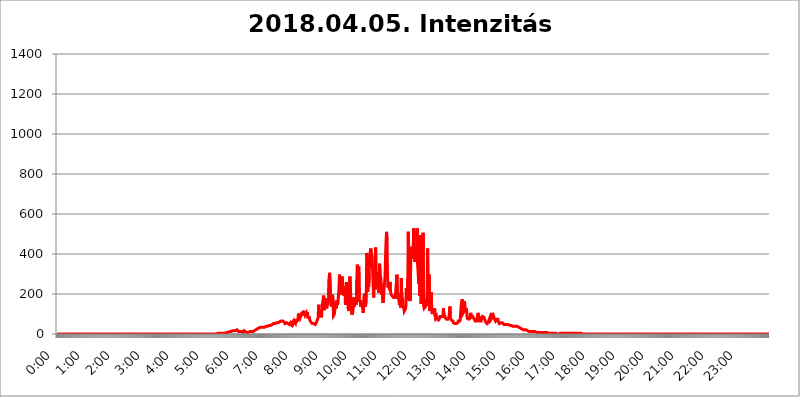
| Category | 2018.04.05. Intenzitás [W/m^2] |
|---|---|
| 0.0 | 0 |
| 0.0006944444444444445 | 0 |
| 0.001388888888888889 | 0 |
| 0.0020833333333333333 | 0 |
| 0.002777777777777778 | 0 |
| 0.003472222222222222 | 0 |
| 0.004166666666666667 | 0 |
| 0.004861111111111111 | 0 |
| 0.005555555555555556 | 0 |
| 0.0062499999999999995 | 0 |
| 0.006944444444444444 | 0 |
| 0.007638888888888889 | 0 |
| 0.008333333333333333 | 0 |
| 0.009027777777777779 | 0 |
| 0.009722222222222222 | 0 |
| 0.010416666666666666 | 0 |
| 0.011111111111111112 | 0 |
| 0.011805555555555555 | 0 |
| 0.012499999999999999 | 0 |
| 0.013194444444444444 | 0 |
| 0.013888888888888888 | 0 |
| 0.014583333333333332 | 0 |
| 0.015277777777777777 | 0 |
| 0.015972222222222224 | 0 |
| 0.016666666666666666 | 0 |
| 0.017361111111111112 | 0 |
| 0.018055555555555557 | 0 |
| 0.01875 | 0 |
| 0.019444444444444445 | 0 |
| 0.02013888888888889 | 0 |
| 0.020833333333333332 | 0 |
| 0.02152777777777778 | 0 |
| 0.022222222222222223 | 0 |
| 0.02291666666666667 | 0 |
| 0.02361111111111111 | 0 |
| 0.024305555555555556 | 0 |
| 0.024999999999999998 | 0 |
| 0.025694444444444447 | 0 |
| 0.02638888888888889 | 0 |
| 0.027083333333333334 | 0 |
| 0.027777777777777776 | 0 |
| 0.02847222222222222 | 0 |
| 0.029166666666666664 | 0 |
| 0.029861111111111113 | 0 |
| 0.030555555555555555 | 0 |
| 0.03125 | 0 |
| 0.03194444444444445 | 0 |
| 0.03263888888888889 | 0 |
| 0.03333333333333333 | 0 |
| 0.034027777777777775 | 0 |
| 0.034722222222222224 | 0 |
| 0.035416666666666666 | 0 |
| 0.036111111111111115 | 0 |
| 0.03680555555555556 | 0 |
| 0.0375 | 0 |
| 0.03819444444444444 | 0 |
| 0.03888888888888889 | 0 |
| 0.03958333333333333 | 0 |
| 0.04027777777777778 | 0 |
| 0.04097222222222222 | 0 |
| 0.041666666666666664 | 0 |
| 0.042361111111111106 | 0 |
| 0.04305555555555556 | 0 |
| 0.043750000000000004 | 0 |
| 0.044444444444444446 | 0 |
| 0.04513888888888889 | 0 |
| 0.04583333333333334 | 0 |
| 0.04652777777777778 | 0 |
| 0.04722222222222222 | 0 |
| 0.04791666666666666 | 0 |
| 0.04861111111111111 | 0 |
| 0.049305555555555554 | 0 |
| 0.049999999999999996 | 0 |
| 0.05069444444444445 | 0 |
| 0.051388888888888894 | 0 |
| 0.052083333333333336 | 0 |
| 0.05277777777777778 | 0 |
| 0.05347222222222222 | 0 |
| 0.05416666666666667 | 0 |
| 0.05486111111111111 | 0 |
| 0.05555555555555555 | 0 |
| 0.05625 | 0 |
| 0.05694444444444444 | 0 |
| 0.057638888888888885 | 0 |
| 0.05833333333333333 | 0 |
| 0.05902777777777778 | 0 |
| 0.059722222222222225 | 0 |
| 0.06041666666666667 | 0 |
| 0.061111111111111116 | 0 |
| 0.06180555555555556 | 0 |
| 0.0625 | 0 |
| 0.06319444444444444 | 0 |
| 0.06388888888888888 | 0 |
| 0.06458333333333334 | 0 |
| 0.06527777777777778 | 0 |
| 0.06597222222222222 | 0 |
| 0.06666666666666667 | 0 |
| 0.06736111111111111 | 0 |
| 0.06805555555555555 | 0 |
| 0.06874999999999999 | 0 |
| 0.06944444444444443 | 0 |
| 0.07013888888888889 | 0 |
| 0.07083333333333333 | 0 |
| 0.07152777777777779 | 0 |
| 0.07222222222222223 | 0 |
| 0.07291666666666667 | 0 |
| 0.07361111111111111 | 0 |
| 0.07430555555555556 | 0 |
| 0.075 | 0 |
| 0.07569444444444444 | 0 |
| 0.0763888888888889 | 0 |
| 0.07708333333333334 | 0 |
| 0.07777777777777778 | 0 |
| 0.07847222222222222 | 0 |
| 0.07916666666666666 | 0 |
| 0.0798611111111111 | 0 |
| 0.08055555555555556 | 0 |
| 0.08125 | 0 |
| 0.08194444444444444 | 0 |
| 0.08263888888888889 | 0 |
| 0.08333333333333333 | 0 |
| 0.08402777777777777 | 0 |
| 0.08472222222222221 | 0 |
| 0.08541666666666665 | 0 |
| 0.08611111111111112 | 0 |
| 0.08680555555555557 | 0 |
| 0.08750000000000001 | 0 |
| 0.08819444444444445 | 0 |
| 0.08888888888888889 | 0 |
| 0.08958333333333333 | 0 |
| 0.09027777777777778 | 0 |
| 0.09097222222222222 | 0 |
| 0.09166666666666667 | 0 |
| 0.09236111111111112 | 0 |
| 0.09305555555555556 | 0 |
| 0.09375 | 0 |
| 0.09444444444444444 | 0 |
| 0.09513888888888888 | 0 |
| 0.09583333333333333 | 0 |
| 0.09652777777777777 | 0 |
| 0.09722222222222222 | 0 |
| 0.09791666666666667 | 0 |
| 0.09861111111111111 | 0 |
| 0.09930555555555555 | 0 |
| 0.09999999999999999 | 0 |
| 0.10069444444444443 | 0 |
| 0.1013888888888889 | 0 |
| 0.10208333333333335 | 0 |
| 0.10277777777777779 | 0 |
| 0.10347222222222223 | 0 |
| 0.10416666666666667 | 0 |
| 0.10486111111111111 | 0 |
| 0.10555555555555556 | 0 |
| 0.10625 | 0 |
| 0.10694444444444444 | 0 |
| 0.1076388888888889 | 0 |
| 0.10833333333333334 | 0 |
| 0.10902777777777778 | 0 |
| 0.10972222222222222 | 0 |
| 0.1111111111111111 | 0 |
| 0.11180555555555556 | 0 |
| 0.11180555555555556 | 0 |
| 0.1125 | 0 |
| 0.11319444444444444 | 0 |
| 0.11388888888888889 | 0 |
| 0.11458333333333333 | 0 |
| 0.11527777777777777 | 0 |
| 0.11597222222222221 | 0 |
| 0.11666666666666665 | 0 |
| 0.1173611111111111 | 0 |
| 0.11805555555555557 | 0 |
| 0.11944444444444445 | 0 |
| 0.12013888888888889 | 0 |
| 0.12083333333333333 | 0 |
| 0.12152777777777778 | 0 |
| 0.12222222222222223 | 0 |
| 0.12291666666666667 | 0 |
| 0.12291666666666667 | 0 |
| 0.12361111111111112 | 0 |
| 0.12430555555555556 | 0 |
| 0.125 | 0 |
| 0.12569444444444444 | 0 |
| 0.12638888888888888 | 0 |
| 0.12708333333333333 | 0 |
| 0.16875 | 0 |
| 0.12847222222222224 | 0 |
| 0.12916666666666668 | 0 |
| 0.12986111111111112 | 0 |
| 0.13055555555555556 | 0 |
| 0.13125 | 0 |
| 0.13194444444444445 | 0 |
| 0.1326388888888889 | 0 |
| 0.13333333333333333 | 0 |
| 0.13402777777777777 | 0 |
| 0.13402777777777777 | 0 |
| 0.13472222222222222 | 0 |
| 0.13541666666666666 | 0 |
| 0.1361111111111111 | 0 |
| 0.13749999999999998 | 0 |
| 0.13819444444444443 | 0 |
| 0.1388888888888889 | 0 |
| 0.13958333333333334 | 0 |
| 0.14027777777777778 | 0 |
| 0.14097222222222222 | 0 |
| 0.14166666666666666 | 0 |
| 0.1423611111111111 | 0 |
| 0.14305555555555557 | 0 |
| 0.14375000000000002 | 0 |
| 0.14444444444444446 | 0 |
| 0.1451388888888889 | 0 |
| 0.1451388888888889 | 0 |
| 0.14652777777777778 | 0 |
| 0.14722222222222223 | 0 |
| 0.14791666666666667 | 0 |
| 0.1486111111111111 | 0 |
| 0.14930555555555555 | 0 |
| 0.15 | 0 |
| 0.15069444444444444 | 0 |
| 0.15138888888888888 | 0 |
| 0.15208333333333332 | 0 |
| 0.15277777777777776 | 0 |
| 0.15347222222222223 | 0 |
| 0.15416666666666667 | 0 |
| 0.15486111111111112 | 0 |
| 0.15555555555555556 | 0 |
| 0.15625 | 0 |
| 0.15694444444444444 | 0 |
| 0.15763888888888888 | 0 |
| 0.15833333333333333 | 0 |
| 0.15902777777777777 | 0 |
| 0.15972222222222224 | 0 |
| 0.16041666666666668 | 0 |
| 0.16111111111111112 | 0 |
| 0.16180555555555556 | 0 |
| 0.1625 | 0 |
| 0.16319444444444445 | 0 |
| 0.1638888888888889 | 0 |
| 0.16458333333333333 | 0 |
| 0.16527777777777777 | 0 |
| 0.16597222222222222 | 0 |
| 0.16666666666666666 | 0 |
| 0.1673611111111111 | 0 |
| 0.16805555555555554 | 0 |
| 0.16874999999999998 | 0 |
| 0.16944444444444443 | 0 |
| 0.17013888888888887 | 0 |
| 0.1708333333333333 | 0 |
| 0.17152777777777775 | 0 |
| 0.17222222222222225 | 0 |
| 0.1729166666666667 | 0 |
| 0.17361111111111113 | 0 |
| 0.17430555555555557 | 0 |
| 0.17500000000000002 | 0 |
| 0.17569444444444446 | 0 |
| 0.1763888888888889 | 0 |
| 0.17708333333333334 | 0 |
| 0.17777777777777778 | 0 |
| 0.17847222222222223 | 0 |
| 0.17916666666666667 | 0 |
| 0.1798611111111111 | 0 |
| 0.18055555555555555 | 0 |
| 0.18125 | 0 |
| 0.18194444444444444 | 0 |
| 0.1826388888888889 | 0 |
| 0.18333333333333335 | 0 |
| 0.1840277777777778 | 0 |
| 0.18472222222222223 | 0 |
| 0.18541666666666667 | 0 |
| 0.18611111111111112 | 0 |
| 0.18680555555555556 | 0 |
| 0.1875 | 0 |
| 0.18819444444444444 | 0 |
| 0.18888888888888888 | 0 |
| 0.18958333333333333 | 0 |
| 0.19027777777777777 | 0 |
| 0.1909722222222222 | 0 |
| 0.19166666666666665 | 0 |
| 0.19236111111111112 | 0 |
| 0.19305555555555554 | 0 |
| 0.19375 | 0 |
| 0.19444444444444445 | 0 |
| 0.1951388888888889 | 0 |
| 0.19583333333333333 | 0 |
| 0.19652777777777777 | 0 |
| 0.19722222222222222 | 0 |
| 0.19791666666666666 | 0 |
| 0.1986111111111111 | 0 |
| 0.19930555555555554 | 0 |
| 0.19999999999999998 | 0 |
| 0.20069444444444443 | 0 |
| 0.20138888888888887 | 0 |
| 0.2020833333333333 | 0 |
| 0.2027777777777778 | 0 |
| 0.2034722222222222 | 0 |
| 0.2041666666666667 | 0 |
| 0.20486111111111113 | 0 |
| 0.20555555555555557 | 0 |
| 0.20625000000000002 | 0 |
| 0.20694444444444446 | 0 |
| 0.2076388888888889 | 0 |
| 0.20833333333333334 | 0 |
| 0.20902777777777778 | 0 |
| 0.20972222222222223 | 0 |
| 0.21041666666666667 | 0 |
| 0.2111111111111111 | 0 |
| 0.21180555555555555 | 0 |
| 0.2125 | 0 |
| 0.21319444444444444 | 0 |
| 0.2138888888888889 | 0 |
| 0.21458333333333335 | 0 |
| 0.2152777777777778 | 0 |
| 0.21597222222222223 | 0 |
| 0.21666666666666667 | 0 |
| 0.21736111111111112 | 0 |
| 0.21805555555555556 | 0 |
| 0.21875 | 0 |
| 0.21944444444444444 | 0 |
| 0.22013888888888888 | 0 |
| 0.22083333333333333 | 0 |
| 0.22152777777777777 | 0 |
| 0.2222222222222222 | 0 |
| 0.22291666666666665 | 0 |
| 0.2236111111111111 | 0 |
| 0.22430555555555556 | 3.525 |
| 0.225 | 3.525 |
| 0.22569444444444445 | 3.525 |
| 0.2263888888888889 | 3.525 |
| 0.22708333333333333 | 3.525 |
| 0.22777777777777777 | 3.525 |
| 0.22847222222222222 | 3.525 |
| 0.22916666666666666 | 3.525 |
| 0.2298611111111111 | 3.525 |
| 0.23055555555555554 | 3.525 |
| 0.23124999999999998 | 3.525 |
| 0.23194444444444443 | 3.525 |
| 0.23263888888888887 | 3.525 |
| 0.2333333333333333 | 3.525 |
| 0.2340277777777778 | 3.525 |
| 0.2347222222222222 | 3.525 |
| 0.2354166666666667 | 3.525 |
| 0.23611111111111113 | 3.525 |
| 0.23680555555555557 | 7.887 |
| 0.23750000000000002 | 7.887 |
| 0.23819444444444446 | 7.887 |
| 0.2388888888888889 | 7.887 |
| 0.23958333333333334 | 7.887 |
| 0.24027777777777778 | 7.887 |
| 0.24097222222222223 | 7.887 |
| 0.24166666666666667 | 12.257 |
| 0.2423611111111111 | 12.257 |
| 0.24305555555555555 | 12.257 |
| 0.24375 | 12.257 |
| 0.24444444444444446 | 12.257 |
| 0.24513888888888888 | 16.636 |
| 0.24583333333333335 | 16.636 |
| 0.2465277777777778 | 16.636 |
| 0.24722222222222223 | 16.636 |
| 0.24791666666666667 | 16.636 |
| 0.24861111111111112 | 21.024 |
| 0.24930555555555556 | 16.636 |
| 0.25 | 16.636 |
| 0.25069444444444444 | 21.024 |
| 0.2513888888888889 | 21.024 |
| 0.2520833333333333 | 21.024 |
| 0.25277777777777777 | 21.024 |
| 0.2534722222222222 | 16.636 |
| 0.25416666666666665 | 12.257 |
| 0.2548611111111111 | 12.257 |
| 0.2555555555555556 | 16.636 |
| 0.25625000000000003 | 12.257 |
| 0.2569444444444445 | 12.257 |
| 0.2576388888888889 | 12.257 |
| 0.25833333333333336 | 12.257 |
| 0.2590277777777778 | 12.257 |
| 0.25972222222222224 | 7.887 |
| 0.2604166666666667 | 7.887 |
| 0.2611111111111111 | 12.257 |
| 0.26180555555555557 | 16.636 |
| 0.2625 | 16.636 |
| 0.26319444444444445 | 12.257 |
| 0.2638888888888889 | 12.257 |
| 0.26458333333333334 | 16.636 |
| 0.2652777777777778 | 12.257 |
| 0.2659722222222222 | 7.887 |
| 0.26666666666666666 | 7.887 |
| 0.2673611111111111 | 7.887 |
| 0.26805555555555555 | 7.887 |
| 0.26875 | 12.257 |
| 0.26944444444444443 | 12.257 |
| 0.2701388888888889 | 12.257 |
| 0.2708333333333333 | 12.257 |
| 0.27152777777777776 | 12.257 |
| 0.2722222222222222 | 12.257 |
| 0.27291666666666664 | 12.257 |
| 0.2736111111111111 | 12.257 |
| 0.2743055555555555 | 12.257 |
| 0.27499999999999997 | 12.257 |
| 0.27569444444444446 | 12.257 |
| 0.27638888888888885 | 16.636 |
| 0.27708333333333335 | 16.636 |
| 0.2777777777777778 | 16.636 |
| 0.27847222222222223 | 21.024 |
| 0.2791666666666667 | 25.419 |
| 0.2798611111111111 | 25.419 |
| 0.28055555555555556 | 25.419 |
| 0.28125 | 29.823 |
| 0.28194444444444444 | 29.823 |
| 0.2826388888888889 | 29.823 |
| 0.2833333333333333 | 29.823 |
| 0.28402777777777777 | 34.234 |
| 0.2847222222222222 | 34.234 |
| 0.28541666666666665 | 34.234 |
| 0.28611111111111115 | 34.234 |
| 0.28680555555555554 | 34.234 |
| 0.28750000000000003 | 34.234 |
| 0.2881944444444445 | 34.234 |
| 0.2888888888888889 | 34.234 |
| 0.28958333333333336 | 34.234 |
| 0.2902777777777778 | 34.234 |
| 0.29097222222222224 | 34.234 |
| 0.2916666666666667 | 38.653 |
| 0.2923611111111111 | 38.653 |
| 0.29305555555555557 | 38.653 |
| 0.29375 | 38.653 |
| 0.29444444444444445 | 38.653 |
| 0.2951388888888889 | 38.653 |
| 0.29583333333333334 | 38.653 |
| 0.2965277777777778 | 43.079 |
| 0.2972222222222222 | 43.079 |
| 0.29791666666666666 | 43.079 |
| 0.2986111111111111 | 43.079 |
| 0.29930555555555555 | 43.079 |
| 0.3 | 43.079 |
| 0.30069444444444443 | 47.511 |
| 0.3013888888888889 | 47.511 |
| 0.3020833333333333 | 47.511 |
| 0.30277777777777776 | 51.951 |
| 0.3034722222222222 | 51.951 |
| 0.30416666666666664 | 51.951 |
| 0.3048611111111111 | 51.951 |
| 0.3055555555555555 | 51.951 |
| 0.30624999999999997 | 56.398 |
| 0.3069444444444444 | 56.398 |
| 0.3076388888888889 | 56.398 |
| 0.30833333333333335 | 56.398 |
| 0.3090277777777778 | 56.398 |
| 0.30972222222222223 | 56.398 |
| 0.3104166666666667 | 60.85 |
| 0.3111111111111111 | 60.85 |
| 0.31180555555555556 | 60.85 |
| 0.3125 | 60.85 |
| 0.31319444444444444 | 60.85 |
| 0.3138888888888889 | 65.31 |
| 0.3145833333333333 | 65.31 |
| 0.31527777777777777 | 65.31 |
| 0.3159722222222222 | 65.31 |
| 0.31666666666666665 | 65.31 |
| 0.31736111111111115 | 65.31 |
| 0.31805555555555554 | 60.85 |
| 0.31875000000000003 | 60.85 |
| 0.3194444444444445 | 51.951 |
| 0.3201388888888889 | 51.951 |
| 0.32083333333333336 | 56.398 |
| 0.3215277777777778 | 56.398 |
| 0.32222222222222224 | 56.398 |
| 0.3229166666666667 | 51.951 |
| 0.3236111111111111 | 51.951 |
| 0.32430555555555557 | 51.951 |
| 0.325 | 51.951 |
| 0.32569444444444445 | 47.511 |
| 0.3263888888888889 | 51.951 |
| 0.32708333333333334 | 56.398 |
| 0.3277777777777778 | 51.951 |
| 0.3284722222222222 | 47.511 |
| 0.32916666666666666 | 47.511 |
| 0.3298611111111111 | 56.398 |
| 0.33055555555555555 | 47.511 |
| 0.33125 | 51.951 |
| 0.33194444444444443 | 56.398 |
| 0.3326388888888889 | 65.31 |
| 0.3333333333333333 | 65.31 |
| 0.3340277777777778 | 56.398 |
| 0.3347222222222222 | 74.246 |
| 0.3354166666666667 | 60.85 |
| 0.3361111111111111 | 65.31 |
| 0.3368055555555556 | 60.85 |
| 0.33749999999999997 | 69.775 |
| 0.33819444444444446 | 96.682 |
| 0.33888888888888885 | 92.184 |
| 0.33958333333333335 | 92.184 |
| 0.34027777777777773 | 96.682 |
| 0.34097222222222223 | 83.205 |
| 0.3416666666666666 | 78.722 |
| 0.3423611111111111 | 96.682 |
| 0.3430555555555555 | 105.69 |
| 0.34375 | 105.69 |
| 0.3444444444444445 | 101.184 |
| 0.3451388888888889 | 110.201 |
| 0.3458333333333334 | 101.184 |
| 0.34652777777777777 | 92.184 |
| 0.34722222222222227 | 114.716 |
| 0.34791666666666665 | 96.682 |
| 0.34861111111111115 | 101.184 |
| 0.34930555555555554 | 105.69 |
| 0.35000000000000003 | 92.184 |
| 0.3506944444444444 | 110.201 |
| 0.3513888888888889 | 83.205 |
| 0.3520833333333333 | 78.722 |
| 0.3527777777777778 | 78.722 |
| 0.3534722222222222 | 83.205 |
| 0.3541666666666667 | 69.775 |
| 0.3548611111111111 | 65.31 |
| 0.35555555555555557 | 60.85 |
| 0.35625 | 60.85 |
| 0.35694444444444445 | 56.398 |
| 0.3576388888888889 | 51.951 |
| 0.35833333333333334 | 51.951 |
| 0.3590277777777778 | 51.951 |
| 0.3597222222222222 | 51.951 |
| 0.36041666666666666 | 51.951 |
| 0.3611111111111111 | 47.511 |
| 0.36180555555555555 | 47.511 |
| 0.3625 | 51.951 |
| 0.36319444444444443 | 56.398 |
| 0.3638888888888889 | 56.398 |
| 0.3645833333333333 | 60.85 |
| 0.3652777777777778 | 74.246 |
| 0.3659722222222222 | 83.205 |
| 0.3666666666666667 | 146.423 |
| 0.3673611111111111 | 87.692 |
| 0.3680555555555556 | 110.201 |
| 0.36874999999999997 | 123.758 |
| 0.36944444444444446 | 101.184 |
| 0.37013888888888885 | 83.205 |
| 0.37083333333333335 | 92.184 |
| 0.37152777777777773 | 146.423 |
| 0.37222222222222223 | 155.509 |
| 0.3729166666666666 | 160.056 |
| 0.3736111111111111 | 191.937 |
| 0.3743055555555555 | 119.235 |
| 0.375 | 146.423 |
| 0.3756944444444445 | 178.264 |
| 0.3763888888888889 | 137.347 |
| 0.3770833333333334 | 155.509 |
| 0.37777777777777777 | 128.284 |
| 0.37847222222222227 | 132.814 |
| 0.37916666666666665 | 123.758 |
| 0.37986111111111115 | 173.709 |
| 0.38055555555555554 | 160.056 |
| 0.38125000000000003 | 274.047 |
| 0.3819444444444444 | 305.898 |
| 0.3826388888888889 | 301.354 |
| 0.3833333333333333 | 301.354 |
| 0.3840277777777778 | 146.423 |
| 0.3847222222222222 | 137.347 |
| 0.3854166666666667 | 160.056 |
| 0.3861111111111111 | 196.497 |
| 0.38680555555555557 | 164.605 |
| 0.3875 | 92.184 |
| 0.38819444444444445 | 92.184 |
| 0.3888888888888889 | 101.184 |
| 0.38958333333333334 | 132.814 |
| 0.3902777777777778 | 160.056 |
| 0.3909722222222222 | 128.284 |
| 0.39166666666666666 | 123.758 |
| 0.3923611111111111 | 169.156 |
| 0.39305555555555555 | 146.423 |
| 0.39375 | 160.056 |
| 0.39444444444444443 | 164.605 |
| 0.3951388888888889 | 228.436 |
| 0.3958333333333333 | 296.808 |
| 0.3965277777777778 | 219.309 |
| 0.3972222222222222 | 196.497 |
| 0.3979166666666667 | 255.813 |
| 0.3986111111111111 | 260.373 |
| 0.3993055555555556 | 287.709 |
| 0.39999999999999997 | 274.047 |
| 0.40069444444444446 | 228.436 |
| 0.40138888888888885 | 228.436 |
| 0.40208333333333335 | 191.937 |
| 0.40277777777777773 | 237.564 |
| 0.40347222222222223 | 219.309 |
| 0.4041666666666666 | 146.423 |
| 0.4048611111111111 | 182.82 |
| 0.4055555555555555 | 260.373 |
| 0.40625 | 178.264 |
| 0.4069444444444445 | 251.251 |
| 0.4076388888888889 | 251.251 |
| 0.4083333333333334 | 123.758 |
| 0.40902777777777777 | 114.716 |
| 0.40972222222222227 | 146.423 |
| 0.41041666666666665 | 287.709 |
| 0.41111111111111115 | 233 |
| 0.41180555555555554 | 173.709 |
| 0.41250000000000003 | 114.716 |
| 0.4131944444444444 | 96.682 |
| 0.4138888888888889 | 101.184 |
| 0.4145833333333333 | 110.201 |
| 0.4152777777777778 | 141.884 |
| 0.4159722222222222 | 182.82 |
| 0.4166666666666667 | 137.347 |
| 0.4173611111111111 | 137.347 |
| 0.41805555555555557 | 178.264 |
| 0.41875 | 164.605 |
| 0.41944444444444445 | 146.423 |
| 0.4201388888888889 | 269.49 |
| 0.42083333333333334 | 346.682 |
| 0.4215277777777778 | 314.98 |
| 0.4222222222222222 | 314.98 |
| 0.42291666666666666 | 337.639 |
| 0.4236111111111111 | 178.264 |
| 0.42430555555555555 | 160.056 |
| 0.425 | 169.156 |
| 0.42569444444444443 | 137.347 |
| 0.4263888888888889 | 137.347 |
| 0.4270833333333333 | 155.509 |
| 0.4277777777777778 | 155.509 |
| 0.4284722222222222 | 128.284 |
| 0.4291666666666667 | 105.69 |
| 0.4298611111111111 | 101.184 |
| 0.4305555555555556 | 191.937 |
| 0.43124999999999997 | 201.058 |
| 0.43194444444444446 | 137.347 |
| 0.43263888888888885 | 146.423 |
| 0.43333333333333335 | 160.056 |
| 0.43402777777777773 | 405.108 |
| 0.43472222222222223 | 387.202 |
| 0.4354166666666666 | 210.182 |
| 0.4361111111111111 | 255.813 |
| 0.4368055555555555 | 237.564 |
| 0.4375 | 287.709 |
| 0.4381944444444445 | 391.685 |
| 0.4388888888888889 | 405.108 |
| 0.4395833333333334 | 427.39 |
| 0.44027777777777777 | 427.39 |
| 0.44097222222222227 | 431.833 |
| 0.44166666666666665 | 378.224 |
| 0.44236111111111115 | 310.44 |
| 0.44305555555555554 | 305.898 |
| 0.44375000000000003 | 182.82 |
| 0.4444444444444444 | 314.98 |
| 0.4451388888888889 | 319.517 |
| 0.4458333333333333 | 283.156 |
| 0.4465277777777778 | 431.833 |
| 0.4472222222222222 | 223.873 |
| 0.4479166666666667 | 223.873 |
| 0.4486111111111111 | 287.709 |
| 0.44930555555555557 | 278.603 |
| 0.45 | 228.436 |
| 0.45069444444444445 | 310.44 |
| 0.4513888888888889 | 205.62 |
| 0.45208333333333334 | 351.198 |
| 0.4527777777777778 | 305.898 |
| 0.4534722222222222 | 287.709 |
| 0.45416666666666666 | 269.49 |
| 0.4548611111111111 | 196.497 |
| 0.45555555555555555 | 242.127 |
| 0.45625 | 178.264 |
| 0.45694444444444443 | 155.509 |
| 0.4576388888888889 | 187.378 |
| 0.4583333333333333 | 223.873 |
| 0.4590277777777778 | 228.436 |
| 0.4597222222222222 | 283.156 |
| 0.4604166666666667 | 382.715 |
| 0.4611111111111111 | 458.38 |
| 0.4618055555555556 | 510.885 |
| 0.46249999999999997 | 471.582 |
| 0.46319444444444446 | 292.259 |
| 0.46388888888888885 | 233 |
| 0.46458333333333335 | 233 |
| 0.46527777777777773 | 255.813 |
| 0.46597222222222223 | 219.309 |
| 0.4666666666666666 | 260.373 |
| 0.4673611111111111 | 214.746 |
| 0.4680555555555555 | 201.058 |
| 0.46875 | 201.058 |
| 0.4694444444444445 | 191.937 |
| 0.4701388888888889 | 191.937 |
| 0.4708333333333334 | 187.378 |
| 0.47152777777777777 | 182.82 |
| 0.47222222222222227 | 178.264 |
| 0.47291666666666665 | 182.82 |
| 0.47361111111111115 | 182.82 |
| 0.47430555555555554 | 191.937 |
| 0.47500000000000003 | 191.937 |
| 0.4756944444444444 | 196.497 |
| 0.4763888888888889 | 296.808 |
| 0.4770833333333333 | 178.264 |
| 0.4777777777777778 | 201.058 |
| 0.4784722222222222 | 178.264 |
| 0.4791666666666667 | 169.156 |
| 0.4798611111111111 | 146.423 |
| 0.48055555555555557 | 155.509 |
| 0.48125 | 141.884 |
| 0.48194444444444445 | 132.814 |
| 0.4826388888888889 | 278.603 |
| 0.48333333333333334 | 150.964 |
| 0.4840277777777778 | 150.964 |
| 0.4847222222222222 | 160.056 |
| 0.48541666666666666 | 132.814 |
| 0.4861111111111111 | 141.884 |
| 0.48680555555555555 | 114.716 |
| 0.4875 | 114.716 |
| 0.48819444444444443 | 123.758 |
| 0.4888888888888889 | 132.814 |
| 0.4895833333333333 | 228.436 |
| 0.4902777777777778 | 178.264 |
| 0.4909722222222222 | 169.156 |
| 0.4916666666666667 | 278.603 |
| 0.4923611111111111 | 510.885 |
| 0.4930555555555556 | 287.709 |
| 0.49374999999999997 | 173.709 |
| 0.49444444444444446 | 169.156 |
| 0.49513888888888885 | 164.605 |
| 0.49583333333333335 | 436.27 |
| 0.49652777777777773 | 405.108 |
| 0.49722222222222223 | 427.39 |
| 0.4979166666666666 | 378.224 |
| 0.4986111111111111 | 378.224 |
| 0.4993055555555555 | 431.833 |
| 0.5 | 528.2 |
| 0.5006944444444444 | 471.582 |
| 0.5013888888888889 | 360.221 |
| 0.5020833333333333 | 382.715 |
| 0.5027777777777778 | 387.202 |
| 0.5034722222222222 | 373.729 |
| 0.5041666666666667 | 431.833 |
| 0.5048611111111111 | 528.2 |
| 0.5055555555555555 | 342.162 |
| 0.50625 | 301.354 |
| 0.5069444444444444 | 251.251 |
| 0.5076388888888889 | 328.584 |
| 0.5083333333333333 | 191.937 |
| 0.5090277777777777 | 493.475 |
| 0.5097222222222222 | 191.937 |
| 0.5104166666666666 | 150.964 |
| 0.5111111111111112 | 191.937 |
| 0.5118055555555555 | 274.047 |
| 0.5125000000000001 | 431.833 |
| 0.5131944444444444 | 506.542 |
| 0.513888888888889 | 141.884 |
| 0.5145833333333333 | 128.284 |
| 0.5152777777777778 | 123.758 |
| 0.5159722222222222 | 132.814 |
| 0.5166666666666667 | 137.347 |
| 0.517361111111111 | 164.605 |
| 0.5180555555555556 | 164.605 |
| 0.5187499999999999 | 182.82 |
| 0.5194444444444445 | 427.39 |
| 0.5201388888888888 | 141.884 |
| 0.5208333333333334 | 146.423 |
| 0.5215277777777778 | 296.808 |
| 0.5222222222222223 | 123.758 |
| 0.5229166666666667 | 114.716 |
| 0.5236111111111111 | 160.056 |
| 0.5243055555555556 | 210.182 |
| 0.525 | 150.964 |
| 0.5256944444444445 | 105.69 |
| 0.5263888888888889 | 101.184 |
| 0.5270833333333333 | 105.69 |
| 0.5277777777777778 | 105.69 |
| 0.5284722222222222 | 105.69 |
| 0.5291666666666667 | 128.284 |
| 0.5298611111111111 | 92.184 |
| 0.5305555555555556 | 78.722 |
| 0.53125 | 74.246 |
| 0.5319444444444444 | 87.692 |
| 0.5326388888888889 | 74.246 |
| 0.5333333333333333 | 69.775 |
| 0.5340277777777778 | 69.775 |
| 0.5347222222222222 | 69.775 |
| 0.5354166666666667 | 74.246 |
| 0.5361111111111111 | 78.722 |
| 0.5368055555555555 | 87.692 |
| 0.5375 | 92.184 |
| 0.5381944444444444 | 92.184 |
| 0.5388888888888889 | 87.692 |
| 0.5395833333333333 | 87.692 |
| 0.5402777777777777 | 87.692 |
| 0.5409722222222222 | 87.692 |
| 0.5416666666666666 | 128.284 |
| 0.5423611111111112 | 87.692 |
| 0.5430555555555555 | 96.682 |
| 0.5437500000000001 | 83.205 |
| 0.5444444444444444 | 83.205 |
| 0.545138888888889 | 78.722 |
| 0.5458333333333333 | 74.246 |
| 0.5465277777777778 | 74.246 |
| 0.5472222222222222 | 74.246 |
| 0.5479166666666667 | 74.246 |
| 0.548611111111111 | 74.246 |
| 0.5493055555555556 | 83.205 |
| 0.5499999999999999 | 83.205 |
| 0.5506944444444445 | 137.347 |
| 0.5513888888888888 | 78.722 |
| 0.5520833333333334 | 74.246 |
| 0.5527777777777778 | 69.775 |
| 0.5534722222222223 | 69.775 |
| 0.5541666666666667 | 65.31 |
| 0.5548611111111111 | 65.31 |
| 0.5555555555555556 | 56.398 |
| 0.55625 | 56.398 |
| 0.5569444444444445 | 56.398 |
| 0.5576388888888889 | 51.951 |
| 0.5583333333333333 | 56.398 |
| 0.5590277777777778 | 51.951 |
| 0.5597222222222222 | 51.951 |
| 0.5604166666666667 | 51.951 |
| 0.5611111111111111 | 56.398 |
| 0.5618055555555556 | 56.398 |
| 0.5625 | 65.31 |
| 0.5631944444444444 | 60.85 |
| 0.5638888888888889 | 65.31 |
| 0.5645833333333333 | 65.31 |
| 0.5652777777777778 | 74.246 |
| 0.5659722222222222 | 78.722 |
| 0.5666666666666667 | 150.964 |
| 0.5673611111111111 | 160.056 |
| 0.5680555555555555 | 173.709 |
| 0.56875 | 101.184 |
| 0.5694444444444444 | 96.682 |
| 0.5701388888888889 | 110.201 |
| 0.5708333333333333 | 164.605 |
| 0.5715277777777777 | 150.964 |
| 0.5722222222222222 | 128.284 |
| 0.5729166666666666 | 110.201 |
| 0.5736111111111112 | 128.284 |
| 0.5743055555555555 | 114.716 |
| 0.5750000000000001 | 78.722 |
| 0.5756944444444444 | 74.246 |
| 0.576388888888889 | 74.246 |
| 0.5770833333333333 | 74.246 |
| 0.5777777777777778 | 74.246 |
| 0.5784722222222222 | 74.246 |
| 0.5791666666666667 | 83.205 |
| 0.579861111111111 | 105.69 |
| 0.5805555555555556 | 83.205 |
| 0.5812499999999999 | 87.692 |
| 0.5819444444444445 | 87.692 |
| 0.5826388888888888 | 87.692 |
| 0.5833333333333334 | 83.205 |
| 0.5840277777777778 | 78.722 |
| 0.5847222222222223 | 74.246 |
| 0.5854166666666667 | 74.246 |
| 0.5861111111111111 | 65.31 |
| 0.5868055555555556 | 65.31 |
| 0.5875 | 65.31 |
| 0.5881944444444445 | 65.31 |
| 0.5888888888888889 | 78.722 |
| 0.5895833333333333 | 78.722 |
| 0.5902777777777778 | 105.69 |
| 0.5909722222222222 | 78.722 |
| 0.5916666666666667 | 74.246 |
| 0.5923611111111111 | 65.31 |
| 0.5930555555555556 | 60.85 |
| 0.59375 | 60.85 |
| 0.5944444444444444 | 65.31 |
| 0.5951388888888889 | 87.692 |
| 0.5958333333333333 | 74.246 |
| 0.5965277777777778 | 87.692 |
| 0.5972222222222222 | 92.184 |
| 0.5979166666666667 | 87.692 |
| 0.5986111111111111 | 83.205 |
| 0.5993055555555555 | 74.246 |
| 0.6 | 74.246 |
| 0.6006944444444444 | 60.85 |
| 0.6013888888888889 | 56.398 |
| 0.6020833333333333 | 60.85 |
| 0.6027777777777777 | 51.951 |
| 0.6034722222222222 | 51.951 |
| 0.6041666666666666 | 56.398 |
| 0.6048611111111112 | 60.85 |
| 0.6055555555555555 | 69.775 |
| 0.6062500000000001 | 65.31 |
| 0.6069444444444444 | 83.205 |
| 0.607638888888889 | 69.775 |
| 0.6083333333333333 | 69.775 |
| 0.6090277777777778 | 74.246 |
| 0.6097222222222222 | 83.205 |
| 0.6104166666666667 | 105.69 |
| 0.611111111111111 | 96.682 |
| 0.6118055555555556 | 92.184 |
| 0.6124999999999999 | 83.205 |
| 0.6131944444444445 | 74.246 |
| 0.6138888888888888 | 69.775 |
| 0.6145833333333334 | 65.31 |
| 0.6152777777777778 | 65.31 |
| 0.6159722222222223 | 74.246 |
| 0.6166666666666667 | 69.775 |
| 0.6173611111111111 | 69.775 |
| 0.6180555555555556 | 74.246 |
| 0.61875 | 60.85 |
| 0.6194444444444445 | 56.398 |
| 0.6201388888888889 | 51.951 |
| 0.6208333333333333 | 56.398 |
| 0.6215277777777778 | 56.398 |
| 0.6222222222222222 | 56.398 |
| 0.6229166666666667 | 56.398 |
| 0.6236111111111111 | 56.398 |
| 0.6243055555555556 | 56.398 |
| 0.625 | 51.951 |
| 0.6256944444444444 | 51.951 |
| 0.6263888888888889 | 47.511 |
| 0.6270833333333333 | 47.511 |
| 0.6277777777777778 | 47.511 |
| 0.6284722222222222 | 47.511 |
| 0.6291666666666667 | 47.511 |
| 0.6298611111111111 | 47.511 |
| 0.6305555555555555 | 47.511 |
| 0.63125 | 47.511 |
| 0.6319444444444444 | 43.079 |
| 0.6326388888888889 | 47.511 |
| 0.6333333333333333 | 47.511 |
| 0.6340277777777777 | 43.079 |
| 0.6347222222222222 | 43.079 |
| 0.6354166666666666 | 43.079 |
| 0.6361111111111112 | 43.079 |
| 0.6368055555555555 | 43.079 |
| 0.6375000000000001 | 43.079 |
| 0.6381944444444444 | 38.653 |
| 0.638888888888889 | 38.653 |
| 0.6395833333333333 | 38.653 |
| 0.6402777777777778 | 38.653 |
| 0.6409722222222222 | 38.653 |
| 0.6416666666666667 | 38.653 |
| 0.642361111111111 | 38.653 |
| 0.6430555555555556 | 38.653 |
| 0.6437499999999999 | 38.653 |
| 0.6444444444444445 | 38.653 |
| 0.6451388888888888 | 38.653 |
| 0.6458333333333334 | 38.653 |
| 0.6465277777777778 | 34.234 |
| 0.6472222222222223 | 34.234 |
| 0.6479166666666667 | 34.234 |
| 0.6486111111111111 | 29.823 |
| 0.6493055555555556 | 29.823 |
| 0.65 | 29.823 |
| 0.6506944444444445 | 25.419 |
| 0.6513888888888889 | 25.419 |
| 0.6520833333333333 | 25.419 |
| 0.6527777777777778 | 25.419 |
| 0.6534722222222222 | 21.024 |
| 0.6541666666666667 | 21.024 |
| 0.6548611111111111 | 21.024 |
| 0.6555555555555556 | 21.024 |
| 0.65625 | 21.024 |
| 0.6569444444444444 | 21.024 |
| 0.6576388888888889 | 21.024 |
| 0.6583333333333333 | 21.024 |
| 0.6590277777777778 | 16.636 |
| 0.6597222222222222 | 16.636 |
| 0.6604166666666667 | 16.636 |
| 0.6611111111111111 | 16.636 |
| 0.6618055555555555 | 12.257 |
| 0.6625 | 16.636 |
| 0.6631944444444444 | 12.257 |
| 0.6638888888888889 | 12.257 |
| 0.6645833333333333 | 12.257 |
| 0.6652777777777777 | 12.257 |
| 0.6659722222222222 | 12.257 |
| 0.6666666666666666 | 12.257 |
| 0.6673611111111111 | 12.257 |
| 0.6680555555555556 | 12.257 |
| 0.6687500000000001 | 12.257 |
| 0.6694444444444444 | 12.257 |
| 0.6701388888888888 | 12.257 |
| 0.6708333333333334 | 12.257 |
| 0.6715277777777778 | 7.887 |
| 0.6722222222222222 | 7.887 |
| 0.6729166666666666 | 7.887 |
| 0.6736111111111112 | 7.887 |
| 0.6743055555555556 | 7.887 |
| 0.6749999999999999 | 7.887 |
| 0.6756944444444444 | 7.887 |
| 0.6763888888888889 | 7.887 |
| 0.6770833333333334 | 7.887 |
| 0.6777777777777777 | 7.887 |
| 0.6784722222222223 | 7.887 |
| 0.6791666666666667 | 7.887 |
| 0.6798611111111111 | 7.887 |
| 0.6805555555555555 | 7.887 |
| 0.68125 | 7.887 |
| 0.6819444444444445 | 7.887 |
| 0.6826388888888889 | 7.887 |
| 0.6833333333333332 | 7.887 |
| 0.6840277777777778 | 7.887 |
| 0.6847222222222222 | 7.887 |
| 0.6854166666666667 | 7.887 |
| 0.686111111111111 | 3.525 |
| 0.6868055555555556 | 7.887 |
| 0.6875 | 7.887 |
| 0.6881944444444444 | 7.887 |
| 0.688888888888889 | 3.525 |
| 0.6895833333333333 | 7.887 |
| 0.6902777777777778 | 3.525 |
| 0.6909722222222222 | 3.525 |
| 0.6916666666666668 | 3.525 |
| 0.6923611111111111 | 3.525 |
| 0.6930555555555555 | 3.525 |
| 0.69375 | 3.525 |
| 0.6944444444444445 | 3.525 |
| 0.6951388888888889 | 3.525 |
| 0.6958333333333333 | 3.525 |
| 0.6965277777777777 | 3.525 |
| 0.6972222222222223 | 3.525 |
| 0.6979166666666666 | 3.525 |
| 0.6986111111111111 | 3.525 |
| 0.6993055555555556 | 3.525 |
| 0.7000000000000001 | 0 |
| 0.7006944444444444 | 3.525 |
| 0.7013888888888888 | 0 |
| 0.7020833333333334 | 0 |
| 0.7027777777777778 | 0 |
| 0.7034722222222222 | 0 |
| 0.7041666666666666 | 3.525 |
| 0.7048611111111112 | 3.525 |
| 0.7055555555555556 | 3.525 |
| 0.7062499999999999 | 3.525 |
| 0.7069444444444444 | 3.525 |
| 0.7076388888888889 | 3.525 |
| 0.7083333333333334 | 3.525 |
| 0.7090277777777777 | 3.525 |
| 0.7097222222222223 | 3.525 |
| 0.7104166666666667 | 3.525 |
| 0.7111111111111111 | 3.525 |
| 0.7118055555555555 | 3.525 |
| 0.7125 | 3.525 |
| 0.7131944444444445 | 3.525 |
| 0.7138888888888889 | 3.525 |
| 0.7145833333333332 | 3.525 |
| 0.7152777777777778 | 3.525 |
| 0.7159722222222222 | 3.525 |
| 0.7166666666666667 | 3.525 |
| 0.717361111111111 | 3.525 |
| 0.7180555555555556 | 3.525 |
| 0.71875 | 3.525 |
| 0.7194444444444444 | 3.525 |
| 0.720138888888889 | 3.525 |
| 0.7208333333333333 | 3.525 |
| 0.7215277777777778 | 3.525 |
| 0.7222222222222222 | 3.525 |
| 0.7229166666666668 | 3.525 |
| 0.7236111111111111 | 3.525 |
| 0.7243055555555555 | 3.525 |
| 0.725 | 3.525 |
| 0.7256944444444445 | 3.525 |
| 0.7263888888888889 | 3.525 |
| 0.7270833333333333 | 3.525 |
| 0.7277777777777777 | 3.525 |
| 0.7284722222222223 | 3.525 |
| 0.7291666666666666 | 3.525 |
| 0.7298611111111111 | 3.525 |
| 0.7305555555555556 | 3.525 |
| 0.7312500000000001 | 3.525 |
| 0.7319444444444444 | 0 |
| 0.7326388888888888 | 3.525 |
| 0.7333333333333334 | 0 |
| 0.7340277777777778 | 0 |
| 0.7347222222222222 | 3.525 |
| 0.7354166666666666 | 0 |
| 0.7361111111111112 | 0 |
| 0.7368055555555556 | 0 |
| 0.7374999999999999 | 0 |
| 0.7381944444444444 | 0 |
| 0.7388888888888889 | 0 |
| 0.7395833333333334 | 0 |
| 0.7402777777777777 | 0 |
| 0.7409722222222223 | 0 |
| 0.7416666666666667 | 0 |
| 0.7423611111111111 | 0 |
| 0.7430555555555555 | 0 |
| 0.74375 | 0 |
| 0.7444444444444445 | 0 |
| 0.7451388888888889 | 0 |
| 0.7458333333333332 | 0 |
| 0.7465277777777778 | 0 |
| 0.7472222222222222 | 0 |
| 0.7479166666666667 | 0 |
| 0.748611111111111 | 0 |
| 0.7493055555555556 | 0 |
| 0.75 | 0 |
| 0.7506944444444444 | 0 |
| 0.751388888888889 | 0 |
| 0.7520833333333333 | 0 |
| 0.7527777777777778 | 0 |
| 0.7534722222222222 | 0 |
| 0.7541666666666668 | 0 |
| 0.7548611111111111 | 0 |
| 0.7555555555555555 | 0 |
| 0.75625 | 0 |
| 0.7569444444444445 | 0 |
| 0.7576388888888889 | 0 |
| 0.7583333333333333 | 0 |
| 0.7590277777777777 | 0 |
| 0.7597222222222223 | 0 |
| 0.7604166666666666 | 0 |
| 0.7611111111111111 | 0 |
| 0.7618055555555556 | 0 |
| 0.7625000000000001 | 0 |
| 0.7631944444444444 | 0 |
| 0.7638888888888888 | 0 |
| 0.7645833333333334 | 0 |
| 0.7652777777777778 | 0 |
| 0.7659722222222222 | 0 |
| 0.7666666666666666 | 0 |
| 0.7673611111111112 | 0 |
| 0.7680555555555556 | 0 |
| 0.7687499999999999 | 0 |
| 0.7694444444444444 | 0 |
| 0.7701388888888889 | 0 |
| 0.7708333333333334 | 0 |
| 0.7715277777777777 | 0 |
| 0.7722222222222223 | 0 |
| 0.7729166666666667 | 0 |
| 0.7736111111111111 | 0 |
| 0.7743055555555555 | 0 |
| 0.775 | 0 |
| 0.7756944444444445 | 0 |
| 0.7763888888888889 | 0 |
| 0.7770833333333332 | 0 |
| 0.7777777777777778 | 0 |
| 0.7784722222222222 | 0 |
| 0.7791666666666667 | 0 |
| 0.779861111111111 | 0 |
| 0.7805555555555556 | 0 |
| 0.78125 | 0 |
| 0.7819444444444444 | 0 |
| 0.782638888888889 | 0 |
| 0.7833333333333333 | 0 |
| 0.7840277777777778 | 0 |
| 0.7847222222222222 | 0 |
| 0.7854166666666668 | 0 |
| 0.7861111111111111 | 0 |
| 0.7868055555555555 | 0 |
| 0.7875 | 0 |
| 0.7881944444444445 | 0 |
| 0.7888888888888889 | 0 |
| 0.7895833333333333 | 0 |
| 0.7902777777777777 | 0 |
| 0.7909722222222223 | 0 |
| 0.7916666666666666 | 0 |
| 0.7923611111111111 | 0 |
| 0.7930555555555556 | 0 |
| 0.7937500000000001 | 0 |
| 0.7944444444444444 | 0 |
| 0.7951388888888888 | 0 |
| 0.7958333333333334 | 0 |
| 0.7965277777777778 | 0 |
| 0.7972222222222222 | 0 |
| 0.7979166666666666 | 0 |
| 0.7986111111111112 | 0 |
| 0.7993055555555556 | 0 |
| 0.7999999999999999 | 0 |
| 0.8006944444444444 | 0 |
| 0.8013888888888889 | 0 |
| 0.8020833333333334 | 0 |
| 0.8027777777777777 | 0 |
| 0.8034722222222223 | 0 |
| 0.8041666666666667 | 0 |
| 0.8048611111111111 | 0 |
| 0.8055555555555555 | 0 |
| 0.80625 | 0 |
| 0.8069444444444445 | 0 |
| 0.8076388888888889 | 0 |
| 0.8083333333333332 | 0 |
| 0.8090277777777778 | 0 |
| 0.8097222222222222 | 0 |
| 0.8104166666666667 | 0 |
| 0.811111111111111 | 0 |
| 0.8118055555555556 | 0 |
| 0.8125 | 0 |
| 0.8131944444444444 | 0 |
| 0.813888888888889 | 0 |
| 0.8145833333333333 | 0 |
| 0.8152777777777778 | 0 |
| 0.8159722222222222 | 0 |
| 0.8166666666666668 | 0 |
| 0.8173611111111111 | 0 |
| 0.8180555555555555 | 0 |
| 0.81875 | 0 |
| 0.8194444444444445 | 0 |
| 0.8201388888888889 | 0 |
| 0.8208333333333333 | 0 |
| 0.8215277777777777 | 0 |
| 0.8222222222222223 | 0 |
| 0.8229166666666666 | 0 |
| 0.8236111111111111 | 0 |
| 0.8243055555555556 | 0 |
| 0.8250000000000001 | 0 |
| 0.8256944444444444 | 0 |
| 0.8263888888888888 | 0 |
| 0.8270833333333334 | 0 |
| 0.8277777777777778 | 0 |
| 0.8284722222222222 | 0 |
| 0.8291666666666666 | 0 |
| 0.8298611111111112 | 0 |
| 0.8305555555555556 | 0 |
| 0.8312499999999999 | 0 |
| 0.8319444444444444 | 0 |
| 0.8326388888888889 | 0 |
| 0.8333333333333334 | 0 |
| 0.8340277777777777 | 0 |
| 0.8347222222222223 | 0 |
| 0.8354166666666667 | 0 |
| 0.8361111111111111 | 0 |
| 0.8368055555555555 | 0 |
| 0.8375 | 0 |
| 0.8381944444444445 | 0 |
| 0.8388888888888889 | 0 |
| 0.8395833333333332 | 0 |
| 0.8402777777777778 | 0 |
| 0.8409722222222222 | 0 |
| 0.8416666666666667 | 0 |
| 0.842361111111111 | 0 |
| 0.8430555555555556 | 0 |
| 0.84375 | 0 |
| 0.8444444444444444 | 0 |
| 0.845138888888889 | 0 |
| 0.8458333333333333 | 0 |
| 0.8465277777777778 | 0 |
| 0.8472222222222222 | 0 |
| 0.8479166666666668 | 0 |
| 0.8486111111111111 | 0 |
| 0.8493055555555555 | 0 |
| 0.85 | 0 |
| 0.8506944444444445 | 0 |
| 0.8513888888888889 | 0 |
| 0.8520833333333333 | 0 |
| 0.8527777777777777 | 0 |
| 0.8534722222222223 | 0 |
| 0.8541666666666666 | 0 |
| 0.8548611111111111 | 0 |
| 0.8555555555555556 | 0 |
| 0.8562500000000001 | 0 |
| 0.8569444444444444 | 0 |
| 0.8576388888888888 | 0 |
| 0.8583333333333334 | 0 |
| 0.8590277777777778 | 0 |
| 0.8597222222222222 | 0 |
| 0.8604166666666666 | 0 |
| 0.8611111111111112 | 0 |
| 0.8618055555555556 | 0 |
| 0.8624999999999999 | 0 |
| 0.8631944444444444 | 0 |
| 0.8638888888888889 | 0 |
| 0.8645833333333334 | 0 |
| 0.8652777777777777 | 0 |
| 0.8659722222222223 | 0 |
| 0.8666666666666667 | 0 |
| 0.8673611111111111 | 0 |
| 0.8680555555555555 | 0 |
| 0.86875 | 0 |
| 0.8694444444444445 | 0 |
| 0.8701388888888889 | 0 |
| 0.8708333333333332 | 0 |
| 0.8715277777777778 | 0 |
| 0.8722222222222222 | 0 |
| 0.8729166666666667 | 0 |
| 0.873611111111111 | 0 |
| 0.8743055555555556 | 0 |
| 0.875 | 0 |
| 0.8756944444444444 | 0 |
| 0.876388888888889 | 0 |
| 0.8770833333333333 | 0 |
| 0.8777777777777778 | 0 |
| 0.8784722222222222 | 0 |
| 0.8791666666666668 | 0 |
| 0.8798611111111111 | 0 |
| 0.8805555555555555 | 0 |
| 0.88125 | 0 |
| 0.8819444444444445 | 0 |
| 0.8826388888888889 | 0 |
| 0.8833333333333333 | 0 |
| 0.8840277777777777 | 0 |
| 0.8847222222222223 | 0 |
| 0.8854166666666666 | 0 |
| 0.8861111111111111 | 0 |
| 0.8868055555555556 | 0 |
| 0.8875000000000001 | 0 |
| 0.8881944444444444 | 0 |
| 0.8888888888888888 | 0 |
| 0.8895833333333334 | 0 |
| 0.8902777777777778 | 0 |
| 0.8909722222222222 | 0 |
| 0.8916666666666666 | 0 |
| 0.8923611111111112 | 0 |
| 0.8930555555555556 | 0 |
| 0.8937499999999999 | 0 |
| 0.8944444444444444 | 0 |
| 0.8951388888888889 | 0 |
| 0.8958333333333334 | 0 |
| 0.8965277777777777 | 0 |
| 0.8972222222222223 | 0 |
| 0.8979166666666667 | 0 |
| 0.8986111111111111 | 0 |
| 0.8993055555555555 | 0 |
| 0.9 | 0 |
| 0.9006944444444445 | 0 |
| 0.9013888888888889 | 0 |
| 0.9020833333333332 | 0 |
| 0.9027777777777778 | 0 |
| 0.9034722222222222 | 0 |
| 0.9041666666666667 | 0 |
| 0.904861111111111 | 0 |
| 0.9055555555555556 | 0 |
| 0.90625 | 0 |
| 0.9069444444444444 | 0 |
| 0.907638888888889 | 0 |
| 0.9083333333333333 | 0 |
| 0.9090277777777778 | 0 |
| 0.9097222222222222 | 0 |
| 0.9104166666666668 | 0 |
| 0.9111111111111111 | 0 |
| 0.9118055555555555 | 0 |
| 0.9125 | 0 |
| 0.9131944444444445 | 0 |
| 0.9138888888888889 | 0 |
| 0.9145833333333333 | 0 |
| 0.9152777777777777 | 0 |
| 0.9159722222222223 | 0 |
| 0.9166666666666666 | 0 |
| 0.9173611111111111 | 0 |
| 0.9180555555555556 | 0 |
| 0.9187500000000001 | 0 |
| 0.9194444444444444 | 0 |
| 0.9201388888888888 | 0 |
| 0.9208333333333334 | 0 |
| 0.9215277777777778 | 0 |
| 0.9222222222222222 | 0 |
| 0.9229166666666666 | 0 |
| 0.9236111111111112 | 0 |
| 0.9243055555555556 | 0 |
| 0.9249999999999999 | 0 |
| 0.9256944444444444 | 0 |
| 0.9263888888888889 | 0 |
| 0.9270833333333334 | 0 |
| 0.9277777777777777 | 0 |
| 0.9284722222222223 | 0 |
| 0.9291666666666667 | 0 |
| 0.9298611111111111 | 0 |
| 0.9305555555555555 | 0 |
| 0.93125 | 0 |
| 0.9319444444444445 | 0 |
| 0.9326388888888889 | 0 |
| 0.9333333333333332 | 0 |
| 0.9340277777777778 | 0 |
| 0.9347222222222222 | 0 |
| 0.9354166666666667 | 0 |
| 0.936111111111111 | 0 |
| 0.9368055555555556 | 0 |
| 0.9375 | 0 |
| 0.9381944444444444 | 0 |
| 0.938888888888889 | 0 |
| 0.9395833333333333 | 0 |
| 0.9402777777777778 | 0 |
| 0.9409722222222222 | 0 |
| 0.9416666666666668 | 0 |
| 0.9423611111111111 | 0 |
| 0.9430555555555555 | 0 |
| 0.94375 | 0 |
| 0.9444444444444445 | 0 |
| 0.9451388888888889 | 0 |
| 0.9458333333333333 | 0 |
| 0.9465277777777777 | 0 |
| 0.9472222222222223 | 0 |
| 0.9479166666666666 | 0 |
| 0.9486111111111111 | 0 |
| 0.9493055555555556 | 0 |
| 0.9500000000000001 | 0 |
| 0.9506944444444444 | 0 |
| 0.9513888888888888 | 0 |
| 0.9520833333333334 | 0 |
| 0.9527777777777778 | 0 |
| 0.9534722222222222 | 0 |
| 0.9541666666666666 | 0 |
| 0.9548611111111112 | 0 |
| 0.9555555555555556 | 0 |
| 0.9562499999999999 | 0 |
| 0.9569444444444444 | 0 |
| 0.9576388888888889 | 0 |
| 0.9583333333333334 | 0 |
| 0.9590277777777777 | 0 |
| 0.9597222222222223 | 0 |
| 0.9604166666666667 | 0 |
| 0.9611111111111111 | 0 |
| 0.9618055555555555 | 0 |
| 0.9625 | 0 |
| 0.9631944444444445 | 0 |
| 0.9638888888888889 | 0 |
| 0.9645833333333332 | 0 |
| 0.9652777777777778 | 0 |
| 0.9659722222222222 | 0 |
| 0.9666666666666667 | 0 |
| 0.967361111111111 | 0 |
| 0.9680555555555556 | 0 |
| 0.96875 | 0 |
| 0.9694444444444444 | 0 |
| 0.970138888888889 | 0 |
| 0.9708333333333333 | 0 |
| 0.9715277777777778 | 0 |
| 0.9722222222222222 | 0 |
| 0.9729166666666668 | 0 |
| 0.9736111111111111 | 0 |
| 0.9743055555555555 | 0 |
| 0.975 | 0 |
| 0.9756944444444445 | 0 |
| 0.9763888888888889 | 0 |
| 0.9770833333333333 | 0 |
| 0.9777777777777777 | 0 |
| 0.9784722222222223 | 0 |
| 0.9791666666666666 | 0 |
| 0.9798611111111111 | 0 |
| 0.9805555555555556 | 0 |
| 0.9812500000000001 | 0 |
| 0.9819444444444444 | 0 |
| 0.9826388888888888 | 0 |
| 0.9833333333333334 | 0 |
| 0.9840277777777778 | 0 |
| 0.9847222222222222 | 0 |
| 0.9854166666666666 | 0 |
| 0.9861111111111112 | 0 |
| 0.9868055555555556 | 0 |
| 0.9874999999999999 | 0 |
| 0.9881944444444444 | 0 |
| 0.9888888888888889 | 0 |
| 0.9895833333333334 | 0 |
| 0.9902777777777777 | 0 |
| 0.9909722222222223 | 0 |
| 0.9916666666666667 | 0 |
| 0.9923611111111111 | 0 |
| 0.9930555555555555 | 0 |
| 0.99375 | 0 |
| 0.9944444444444445 | 0 |
| 0.9951388888888889 | 0 |
| 0.9958333333333332 | 0 |
| 0.9965277777777778 | 0 |
| 0.9972222222222222 | 0 |
| 0.9979166666666667 | 0 |
| 0.998611111111111 | 0 |
| 0.9993055555555556 | 0 |